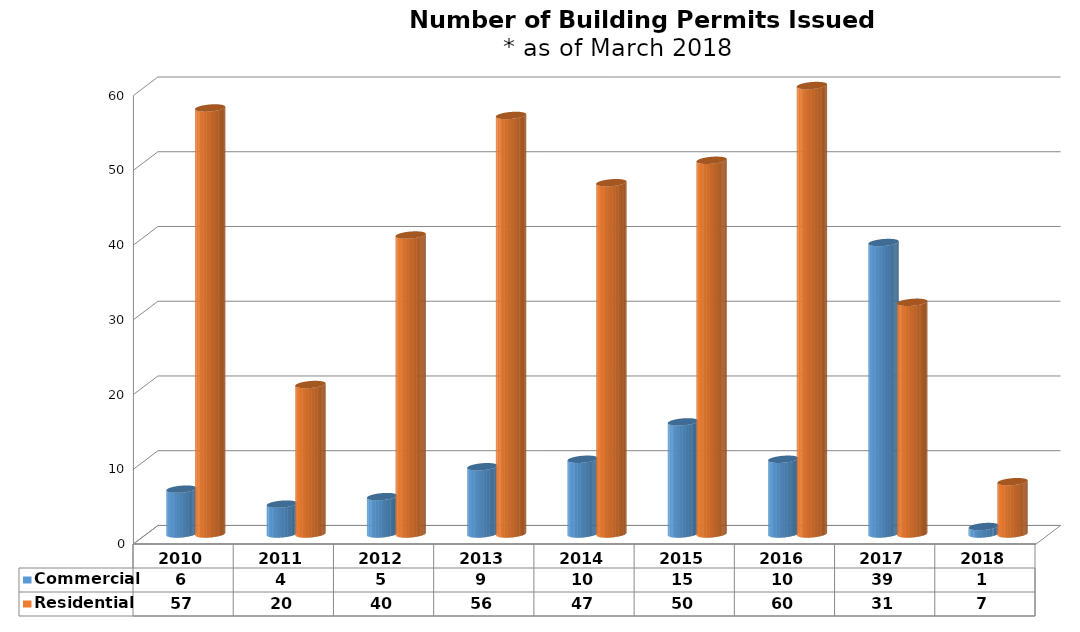
| Category | Commercial | Residential |
|---|---|---|
| 2010.0 | 6 | 57 |
| 2011.0 | 4 | 20 |
| 2012.0 | 5 | 40 |
| 2013.0 | 9 | 56 |
| 2014.0 | 10 | 47 |
| 2015.0 | 15 | 50 |
| 2016.0 | 10 | 60 |
| 2017.0 | 39 | 31 |
| 2018.0 | 1 | 7 |